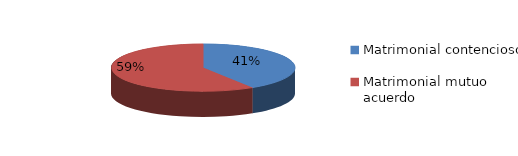
| Category | Series 0 |
|---|---|
| 0 | 223 |
| 1 | 321 |